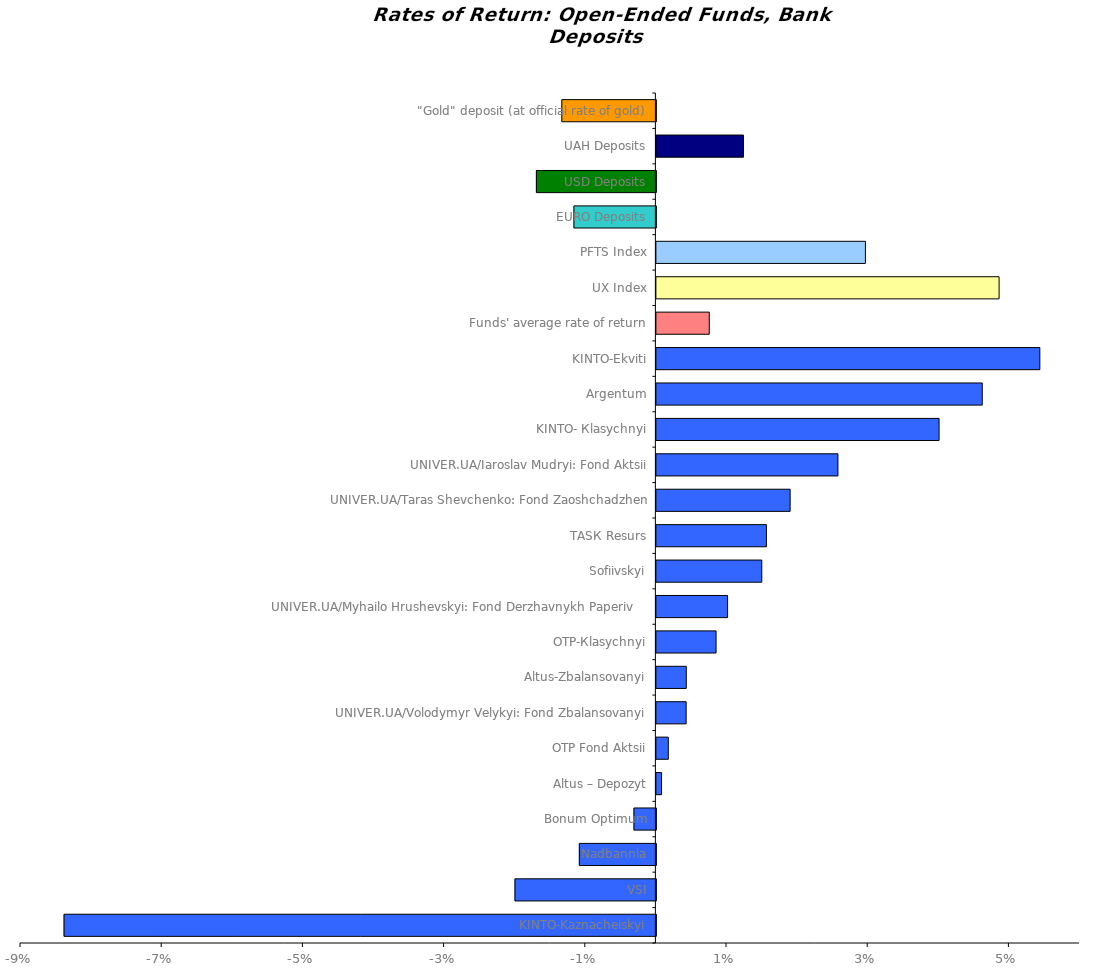
| Category | Series 0 |
|---|---|
| KINTO-Kaznacheiskyi | -0.084 |
| VSI | -0.02 |
| Nadbannia | -0.011 |
| Bonum Optimum | -0.003 |
| Altus – Depozyt | 0.001 |
| ОТP Fond Aktsii | 0.002 |
| UNIVER.UA/Volodymyr Velykyi: Fond Zbalansovanyi | 0.004 |
| Аltus-Zbalansovanyi | 0.004 |
| OTP-Кlasychnyi | 0.008 |
| UNIVER.UA/Myhailo Hrushevskyi: Fond Derzhavnykh Paperiv    | 0.01 |
| Sofiivskyi | 0.015 |
| ТАSК Resurs | 0.016 |
| UNIVER.UA/Taras Shevchenko: Fond Zaoshchadzhen | 0.019 |
| UNIVER.UA/Iaroslav Mudryi: Fond Aktsii | 0.026 |
| KINTO- Кlasychnyi | 0.04 |
| Аrgentum | 0.046 |
| KINTO-Ekviti | 0.054 |
| Funds' average rate of return | 0.007 |
| UX Index | 0.049 |
| PFTS Index | 0.03 |
| EURO Deposits | -0.012 |
| USD Deposits | -0.017 |
| UAH Deposits | 0.012 |
| "Gold" deposit (at official rate of gold) | -0.013 |